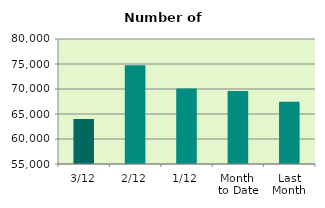
| Category | Series 0 |
|---|---|
| 3/12 | 63994 |
| 2/12 | 74744 |
| 1/12 | 70098 |
| Month 
to Date | 69612 |
| Last
Month | 67470.455 |